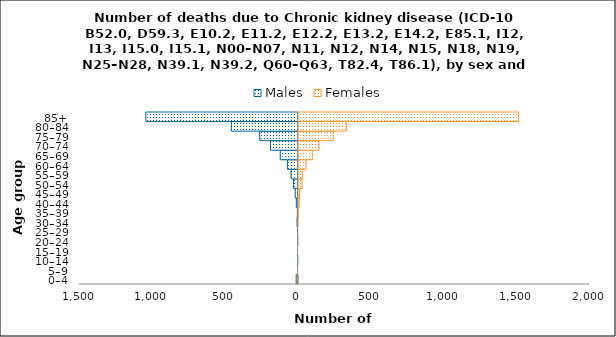
| Category | Males | Females |
|---|---|---|
| 0–4 | -13 | 4 |
| 5–9 | 0 | 0 |
| 10–14 | -1 | 0 |
| 15–19 | 0 | 0 |
| 20–24 | -1 | 0 |
| 25–29 | -4 | 0 |
| 30–34 | -7 | 3 |
| 35–39 | -5 | 4 |
| 40–44 | -12 | 11 |
| 45–49 | -19 | 13 |
| 50–54 | -31 | 30 |
| 55–59 | -48 | 33 |
| 60–64 | -73 | 58 |
| 65–69 | -122 | 101 |
| 70–74 | -189 | 147 |
| 75–79 | -263 | 244 |
| 80–84 | -458 | 337 |
| 85+ | -1045 | 1517 |